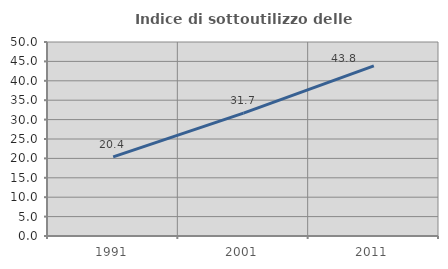
| Category | Indice di sottoutilizzo delle abitazioni  |
|---|---|
| 1991.0 | 20.408 |
| 2001.0 | 31.66 |
| 2011.0 | 43.83 |